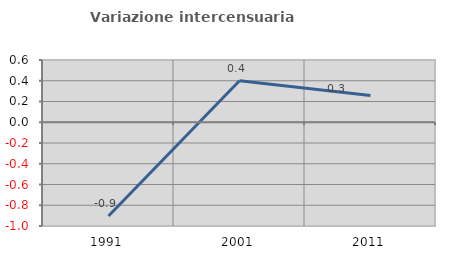
| Category | Variazione intercensuaria annua |
|---|---|
| 1991.0 | -0.904 |
| 2001.0 | 0.4 |
| 2011.0 | 0.258 |